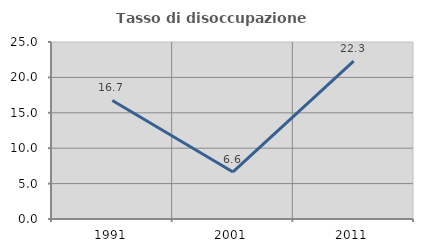
| Category | Tasso di disoccupazione giovanile  |
|---|---|
| 1991.0 | 16.738 |
| 2001.0 | 6.647 |
| 2011.0 | 22.289 |